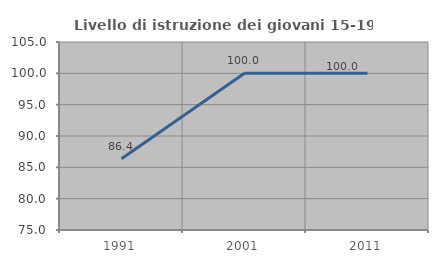
| Category | Livello di istruzione dei giovani 15-19 anni |
|---|---|
| 1991.0 | 86.364 |
| 2001.0 | 100 |
| 2011.0 | 100 |